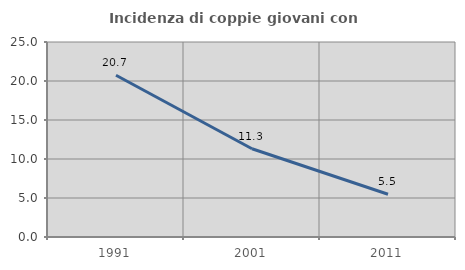
| Category | Incidenza di coppie giovani con figli |
|---|---|
| 1991.0 | 20.744 |
| 2001.0 | 11.314 |
| 2011.0 | 5.477 |